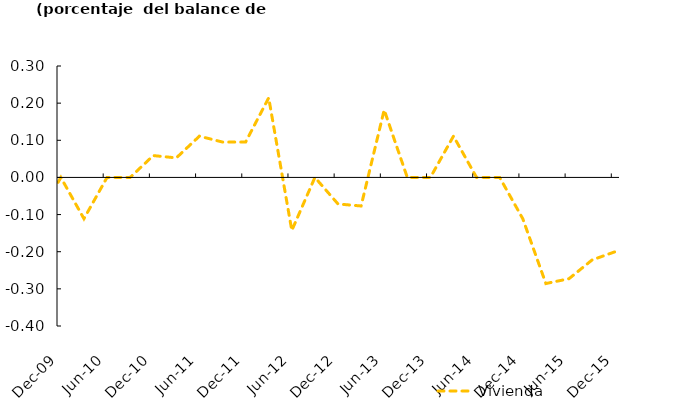
| Category | Vivienda |
|---|---|
| 2008-03-01 | 0 |
| 2008-07-01 | 0 |
| 2008-10-01 | -0.214 |
| 2008-12-01 | -0.2 |
| 2009-03-01 | -0.278 |
| 2009-06-01 | -0.105 |
| 2009-09-01 | -0.111 |
| 2009-12-01 | 0 |
| 2010-03-01 | -0.111 |
| 2010-06-01 | 0 |
| 2010-09-01 | 0 |
| 2010-12-01 | 0.059 |
| 2011-03-01 | 0.053 |
| 2011-06-01 | 0.111 |
| 2011-09-01 | 0.095 |
| 2011-12-01 | 0.095 |
| 2012-03-01 | 0.214 |
| 2012-06-01 | -0.143 |
| 2012-09-01 | 0 |
| 2012-12-01 | -0.071 |
| 2013-03-01 | -0.077 |
| 2013-06-01 | 0.182 |
| 2013-09-01 | 0 |
| 2013-12-01 | 0 |
| 2014-03-01 | 0.111 |
| 2014-06-01 | 0 |
| 2014-09-01 | 0 |
| 2014-12-01 | -0.111 |
| 2015-03-01 | -0.286 |
| 2015-06-01 | -0.273 |
| 2015-09-01 | -0.222 |
| 2015-12-01 | -0.2 |